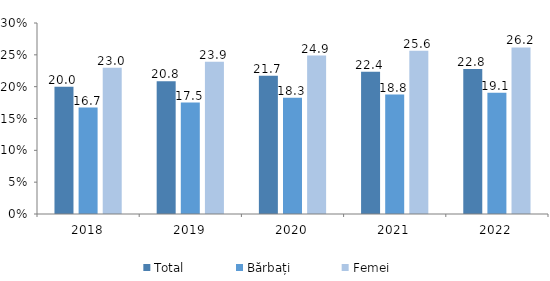
| Category | Total | Bărbați | Femei |
|---|---|---|---|
| 2018.0 | 19.992 | 16.724 | 22.985 |
| 2019.0 | 20.841 | 17.498 | 23.897 |
| 2020.0 | 21.723 | 18.263 | 24.885 |
| 2021.0 | 22.355 | 18.756 | 25.638 |
| 2022.0 | 22.774 | 19.055 | 26.162 |